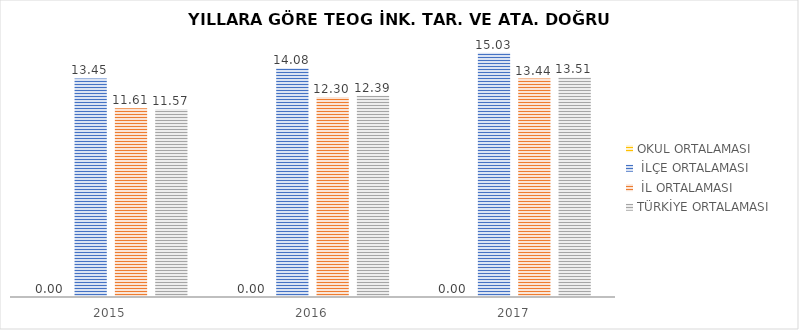
| Category | OKUL ORTALAMASI |  İLÇE ORTALAMASI |  İL ORTALAMASI  | TÜRKİYE ORTALAMASI  |
|---|---|---|---|---|
| 0 | 0 | 13.453 | 11.614 | 11.574 |
| 1 | 0 | 14.076 | 12.301 | 12.388 |
| 2 | 0 | 15.026 | 13.441 | 13.51 |